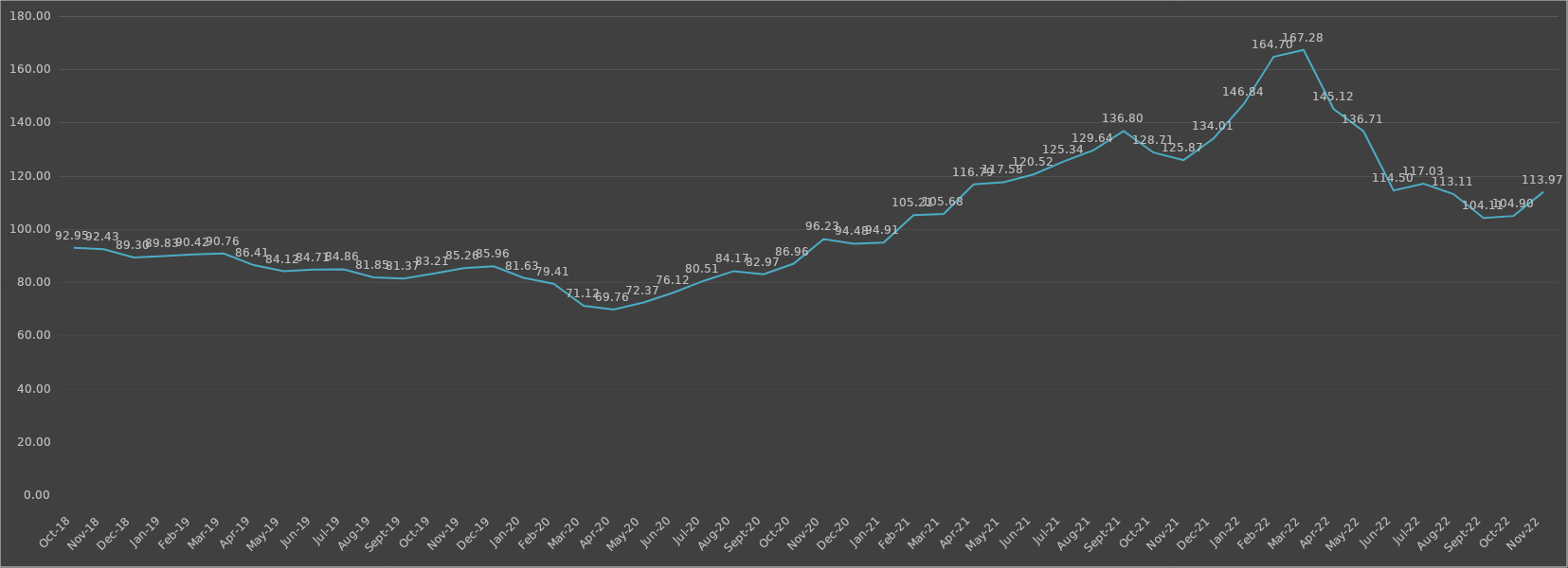
| Category | Series 0 |
|---|---|
| 2018-10-31 | 92.954 |
| 2018-11-30 | 92.429 |
| 2018-12-31 | 89.3 |
| 2019-01-31 | 89.826 |
| 2019-02-28 | 90.423 |
| 2019-03-31 | 90.757 |
| 2019-04-30 | 86.41 |
| 2019-05-31 | 84.118 |
| 2019-06-30 | 84.715 |
| 2019-07-31 | 84.858 |
| 2019-08-31 | 81.849 |
| 2019-09-30 | 81.371 |
| 2019-10-31 | 83.21 |
| 2019-11-30 | 85.264 |
| 2019-12-31 | 85.957 |
| 2020-01-31 | 81.634 |
| 2020-02-29 | 79.412 |
| 2020-03-31 | 71.125 |
| 2020-04-30 | 69.764 |
| 2020-05-31 | 72.367 |
| 2020-06-30 | 76.117 |
| 2020-07-31 | 80.511 |
| 2020-08-31 | 84.165 |
| 2020-09-30 | 82.971 |
| 2020-10-31 | 86.96 |
| 2020-11-30 | 96.226 |
| 2020-12-31 | 94.483 |
| 2021-01-31 | 94.913 |
| 2021-02-28 | 105.207 |
| 2021-03-31 | 105.684 |
| 2021-04-30 | 116.79 |
| 2021-05-31 | 117.578 |
| 2021-06-30 | 120.516 |
| 2021-07-31 | 125.34 |
| 2021-08-31 | 129.639 |
| 2021-09-30 | 136.804 |
| 2021-10-31 | 128.708 |
| 2021-11-30 | 125.866 |
| 2021-12-31 | 134.01 |
| 2022-01-31 | 146.835 |
| 2022-02-28 | 164.7 |
| 2022-03-31 | 167.28 |
| 2022-04-30 | 145.116 |
| 2022-05-31 | 136.709 |
| 2022-06-30 | 114.497 |
| 2022-07-31 | 117.029 |
| 2022-08-31 | 113.112 |
| 2022-09-30 | 104.108 |
| 2022-10-31 | 104.896 |
| 2022-11-30 | 113.972 |